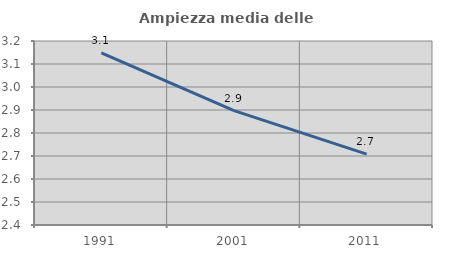
| Category | Ampiezza media delle famiglie |
|---|---|
| 1991.0 | 3.148 |
| 2001.0 | 2.897 |
| 2011.0 | 2.708 |